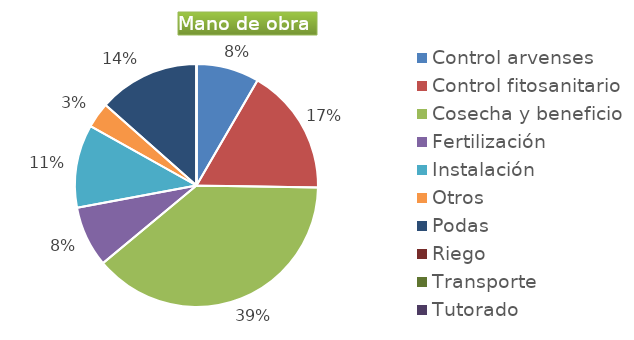
| Category | Series 0 |
|---|---|
| Control arvenses | 3923677 |
| Control fitosanitario | 7913857 |
| Cosecha y beneficio | 18155319 |
| Fertilización | 3790671 |
| Instalación | 5187234 |
| Otros | 1596072 |
| Podas | 6317785 |
| Riego | 0 |
| Transporte | 0 |
| Tutorado | 0 |